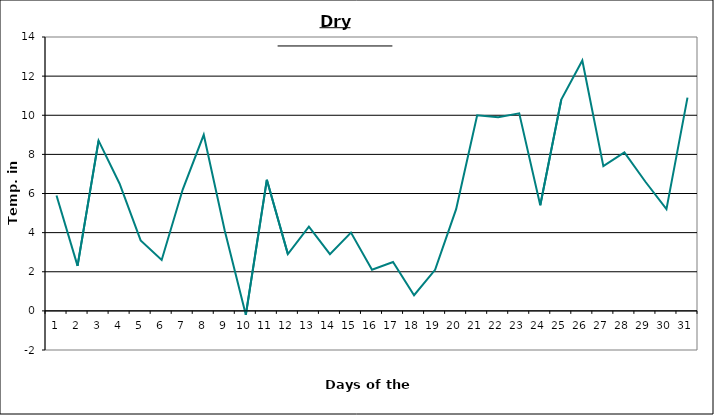
| Category | Series 0 |
|---|---|
| 0 | 5.9 |
| 1 | 2.3 |
| 2 | 8.7 |
| 3 | 6.5 |
| 4 | 3.6 |
| 5 | 2.6 |
| 6 | 6.2 |
| 7 | 9 |
| 8 | 4.1 |
| 9 | -0.2 |
| 10 | 6.7 |
| 11 | 2.9 |
| 12 | 4.3 |
| 13 | 2.9 |
| 14 | 4 |
| 15 | 2.1 |
| 16 | 2.5 |
| 17 | 0.8 |
| 18 | 2.1 |
| 19 | 5.2 |
| 20 | 10 |
| 21 | 9.9 |
| 22 | 10.1 |
| 23 | 5.4 |
| 24 | 10.8 |
| 25 | 12.8 |
| 26 | 7.4 |
| 27 | 8.1 |
| 28 | 6.6 |
| 29 | 5.2 |
| 30 | 10.9 |